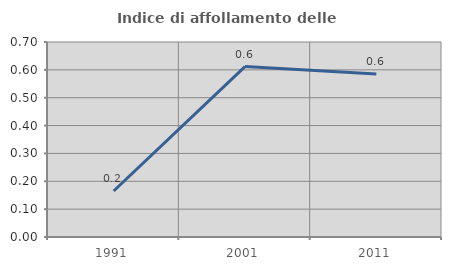
| Category | Indice di affollamento delle abitazioni  |
|---|---|
| 1991.0 | 0.165 |
| 2001.0 | 0.612 |
| 2011.0 | 0.585 |